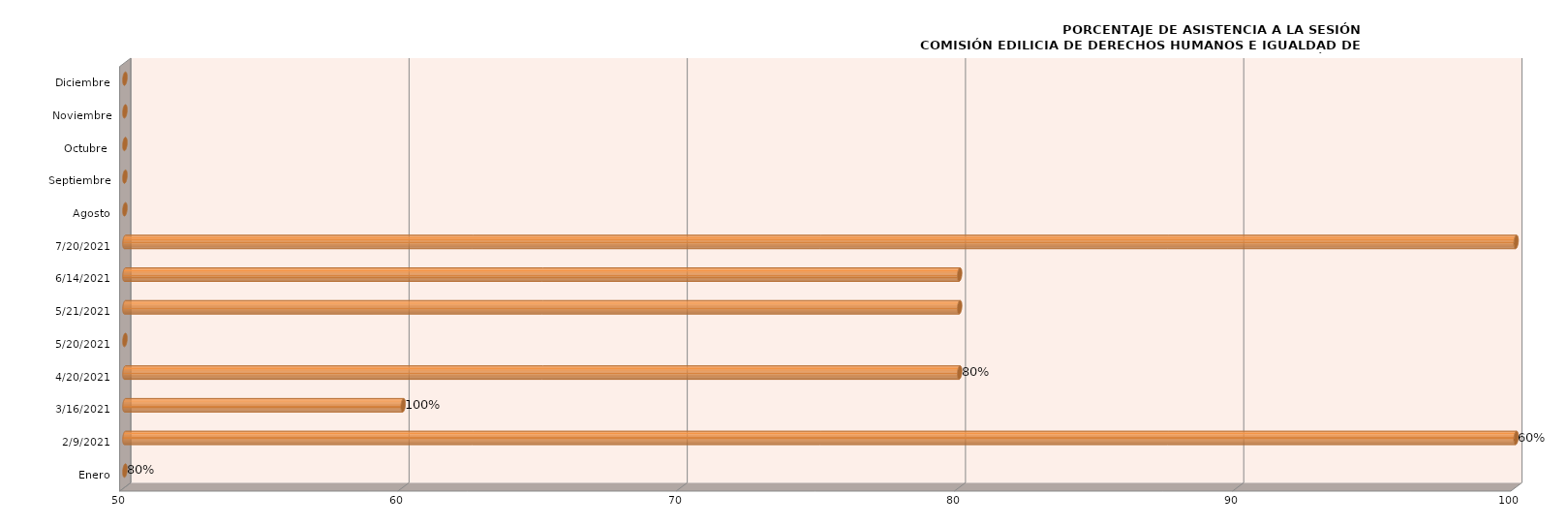
| Category | Series 0 |
|---|---|
| Enero | 0 |
| 09/02/2021 | 100 |
| 16/03/2021 | 60 |
| 20/04/2021 | 80 |
| 20/05/2021 | 0 |
| 21/05/2021 | 80 |
| 14/06/2021 | 80 |
| 20/07/2021 | 100 |
| Agosto | 0 |
| Septiembre | 0 |
| Octubre  | 0 |
| Noviembre | 0 |
| Diciembre | 0 |